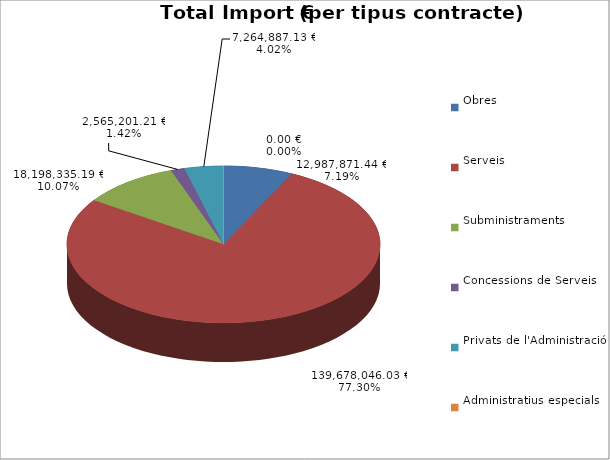
| Category | Total preu
(amb IVA) |
|---|---|
| Obres | 12987871.44 |
| Serveis | 139678046.03 |
| Subministraments | 18198335.19 |
| Concessions de Serveis | 2565201.21 |
| Privats de l'Administració | 7264887.13 |
| Administratius especials | 0 |